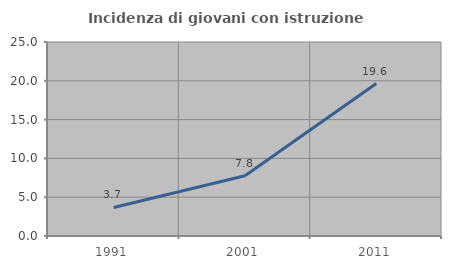
| Category | Incidenza di giovani con istruzione universitaria |
|---|---|
| 1991.0 | 3.682 |
| 2001.0 | 7.756 |
| 2011.0 | 19.65 |